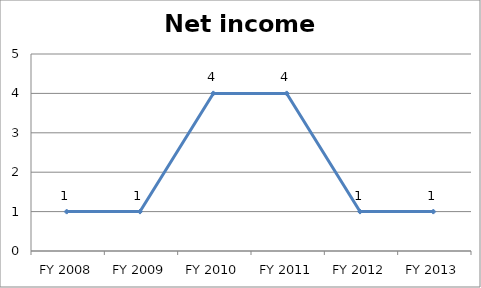
| Category | Net income score |
|---|---|
| FY 2013 | 1 |
| FY 2012 | 1 |
| FY 2011 | 4 |
| FY 2010 | 4 |
| FY 2009 | 1 |
| FY 2008 | 1 |